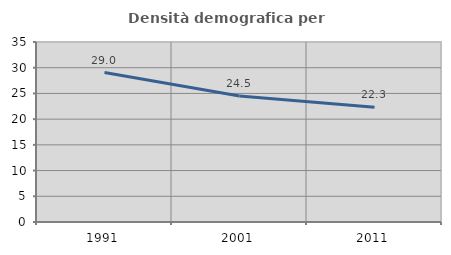
| Category | Densità demografica |
|---|---|
| 1991.0 | 29.05 |
| 2001.0 | 24.483 |
| 2011.0 | 22.314 |